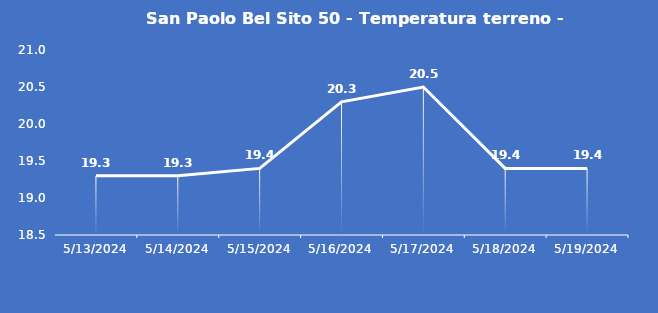
| Category | San Paolo Bel Sito 50 - Temperatura terreno - Grezzo (°C) |
|---|---|
| 5/13/24 | 19.3 |
| 5/14/24 | 19.3 |
| 5/15/24 | 19.4 |
| 5/16/24 | 20.3 |
| 5/17/24 | 20.5 |
| 5/18/24 | 19.4 |
| 5/19/24 | 19.4 |